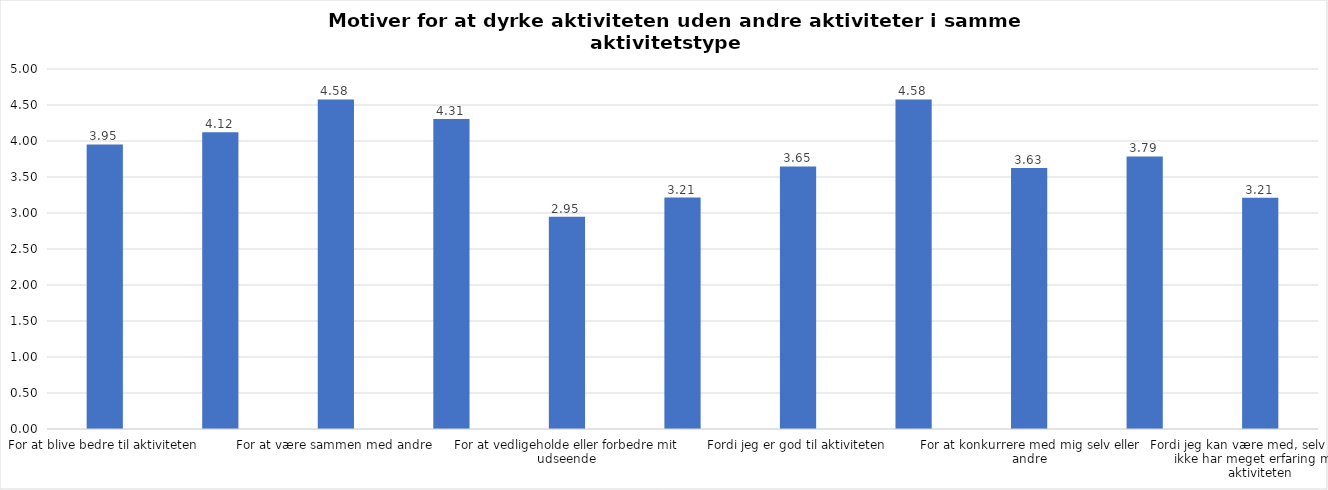
| Category | Gennemsnit |
|---|---|
| For at blive bedre til aktiviteten | 3.953 |
| For at vedligeholde eller forbedre min sundhed (fx helbred, fysisk form) | 4.122 |
| For at være sammen med andre | 4.578 |
| For at gøre noget godt for mig selv | 4.305 |
| For at vedligeholde eller forbedre mit udseende | 2.949 |
| Fordi andre i min omgangskreds opmuntrer mig til det | 3.215 |
| Fordi jeg er god til aktiviteten | 3.647 |
| Fordi jeg godt kan lide aktiviteten | 4.578 |
| For at konkurrere med mig selv eller andre | 3.625 |
| Fordi aktiviteten passer godt ind i min hverdag | 3.786 |
| Fordi jeg kan være med, selv om jeg ikke har meget erfaring med aktiviteten | 3.212 |